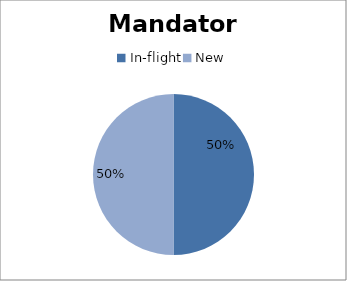
| Category | Series 0 |
|---|---|
| In-flight | 500 |
| New | 500 |